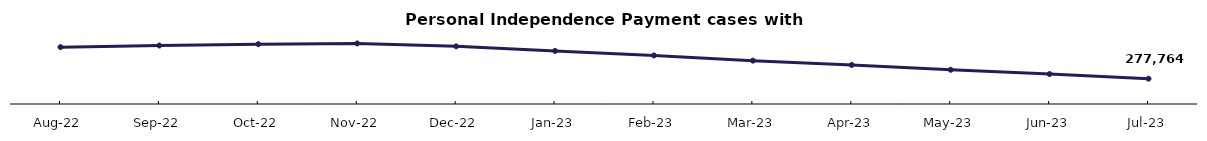
| Category | Series 0 |
|---|---|
| Aug-22 | 324863 |
| Sep-22 | 327298 |
| Oct-22 | 329293 |
| Nov-22 | 330383 |
| Dec-22 | 326062 |
| Jan-23 | 319225 |
| Feb-23 | 312482 |
| Mar-23 | 304717 |
| Apr-23 | 298265 |
| May-23 | 291067 |
| Jun-23 | 284675 |
| Jul-23 | 277764 |